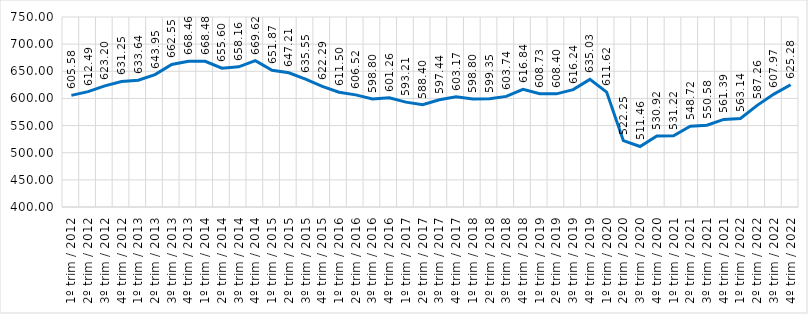
| Category | Series 0 |
|---|---|
| 1º trim / 2012 | 605.579 |
| 2º trim / 2012 | 612.492 |
| 3º trim / 2012 | 623.201 |
| 4º trim / 2012 | 631.255 |
| 1º trim / 2013 | 633.64 |
| 2º trim / 2013 | 643.954 |
| 3º trim / 2013 | 662.552 |
| 4º trim / 2013 | 668.462 |
| 1º trim / 2014 | 668.482 |
| 2º trim / 2014 | 655.597 |
| 3º trim / 2014 | 658.159 |
| 4º trim / 2014 | 669.622 |
| 1º trim / 2015 | 651.87 |
| 2º trim / 2015 | 647.211 |
| 3º trim / 2015 | 635.547 |
| 4º trim / 2015 | 622.294 |
| 1º trim / 2016 | 611.498 |
| 2º trim / 2016 | 606.517 |
| 3º trim / 2016 | 598.801 |
| 4º trim / 2016 | 601.255 |
| 1º trim / 2017 | 593.208 |
| 2º trim / 2017 | 588.396 |
| 3º trim / 2017 | 597.442 |
| 4º trim / 2017 | 603.168 |
| 1º trim / 2018 | 598.799 |
| 2º trim / 2018 | 599.35 |
| 3º trim / 2018 | 603.739 |
| 4º trim / 2018 | 616.836 |
| 1º trim / 2019 | 608.73 |
| 2º trim / 2019 | 608.404 |
| 3º trim / 2019 | 616.235 |
| 4º trim / 2019 | 635.026 |
| 1º trim / 2020 | 611.623 |
| 2º trim / 2020 | 522.245 |
| 3º trim / 2020 | 511.457 |
| 4º trim / 2020 | 530.917 |
| 1º trim / 2021 | 531.216 |
| 2º trim / 2021 | 548.719 |
| 3º trim / 2021 | 550.581 |
| 4º trim / 2021 | 561.387 |
| 1º trim / 2022 | 563.14 |
| 2º trim / 2022 | 587.258 |
| 3º trim / 2022 | 607.974 |
| 4º trim / 2022 | 625.276 |